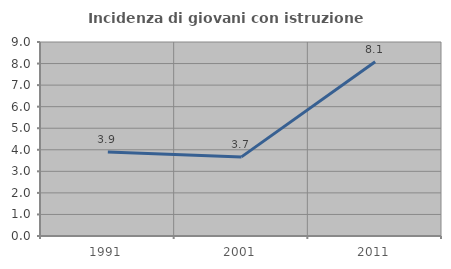
| Category | Incidenza di giovani con istruzione universitaria |
|---|---|
| 1991.0 | 3.896 |
| 2001.0 | 3.67 |
| 2011.0 | 8.081 |